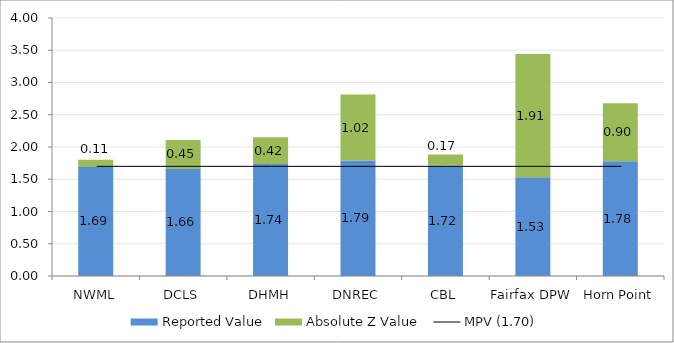
| Category | Reported Value | Absolute Z Value  |
|---|---|---|
| NWML | 1.69 | 0.112 |
| DCLS | 1.66 | 0.449 |
| DHMH | 1.737 | 0.416 |
| DNREC | 1.791 | 1.022 |
| CBL | 1.715 | 0.169 |
| Fairfax DPW | 1.53 | 1.91 |
| Horn Point | 1.78 | 0.899 |